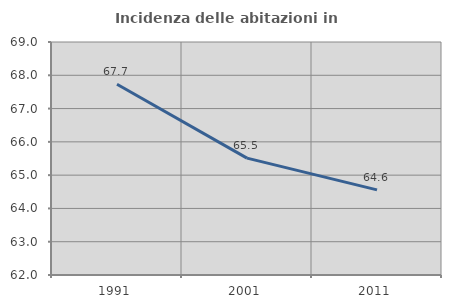
| Category | Incidenza delle abitazioni in proprietà  |
|---|---|
| 1991.0 | 67.73 |
| 2001.0 | 65.511 |
| 2011.0 | 64.557 |